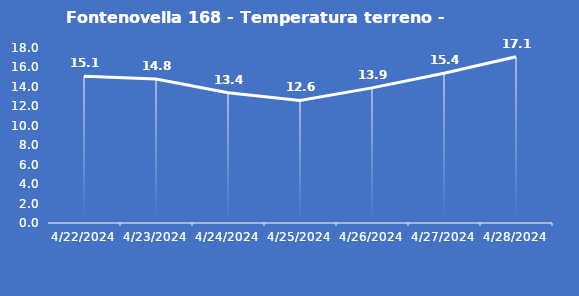
| Category | Fontenovella 168 - Temperatura terreno - Grezzo (°C) |
|---|---|
| 4/22/24 | 15.1 |
| 4/23/24 | 14.8 |
| 4/24/24 | 13.4 |
| 4/25/24 | 12.6 |
| 4/26/24 | 13.9 |
| 4/27/24 | 15.4 |
| 4/28/24 | 17.1 |